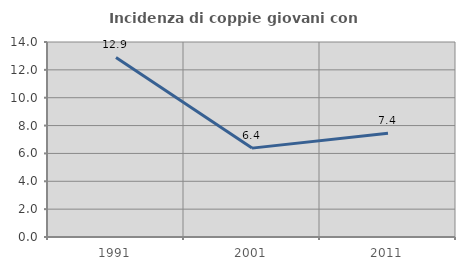
| Category | Incidenza di coppie giovani con figli |
|---|---|
| 1991.0 | 12.888 |
| 2001.0 | 6.381 |
| 2011.0 | 7.445 |